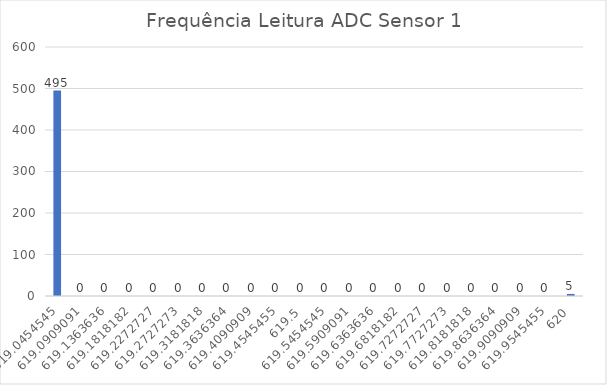
| Category | Series 0 |
|---|---|
| 619.0454545454545 | 495 |
| 619.0909090909091 | 0 |
| 619.1363636363636 | 0 |
| 619.1818181818181 | 0 |
| 619.2272727272727 | 0 |
| 619.2727272727273 | 0 |
| 619.3181818181819 | 0 |
| 619.3636363636364 | 0 |
| 619.4090909090909 | 0 |
| 619.4545454545455 | 0 |
| 619.5 | 0 |
| 619.5454545454545 | 0 |
| 619.5909090909091 | 0 |
| 619.6363636363636 | 0 |
| 619.6818181818181 | 0 |
| 619.7272727272727 | 0 |
| 619.7727272727273 | 0 |
| 619.8181818181819 | 0 |
| 619.8636363636364 | 0 |
| 619.9090909090909 | 0 |
| 619.9545454545455 | 0 |
| 620.0 | 5 |